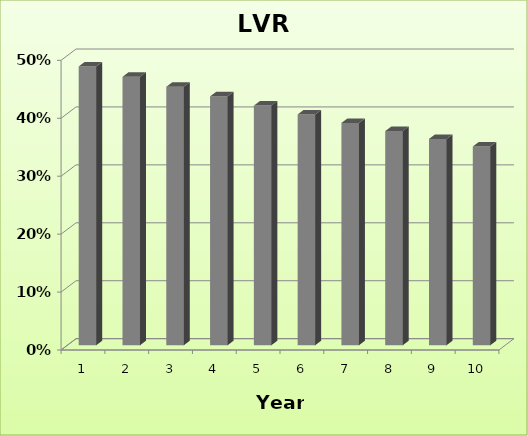
| Category | LVR |
|---|---|
| 0 | 0.481 |
| 1 | 0.463 |
| 2 | 0.446 |
| 3 | 0.43 |
| 4 | 0.414 |
| 5 | 0.398 |
| 6 | 0.384 |
| 7 | 0.37 |
| 8 | 0.356 |
| 9 | 0.343 |